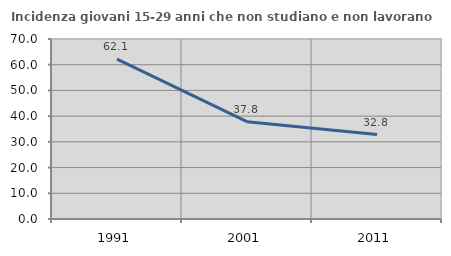
| Category | Incidenza giovani 15-29 anni che non studiano e non lavorano  |
|---|---|
| 1991.0 | 62.135 |
| 2001.0 | 37.836 |
| 2011.0 | 32.841 |